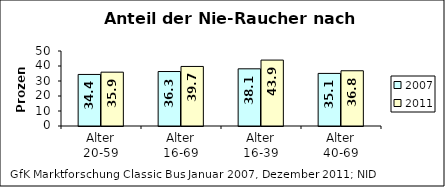
| Category | 2007 | 2011 |
|---|---|---|
| Alter
20-59 | 34.365 | 35.89 |
| Alter
16-69 | 36.315 | 39.704 |
| Alter
16-39 | 38.116 | 43.944 |
| Alter
40-69 | 35.056 | 36.832 |